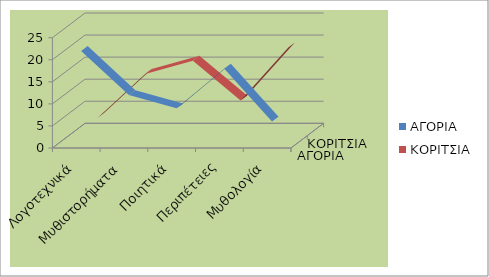
| Category | ΑΓΟΡΙΑ | ΚΟΡΙΤΣΙΑ |
|---|---|---|
| Λογοτεχνικά | 21 | 3 |
| Μυθιστορήματα | 11 | 13 |
| Ποιητικά | 8 | 16 |
| Περιπέτειες | 17 | 7 |
| Μυθολογία | 5 | 19 |